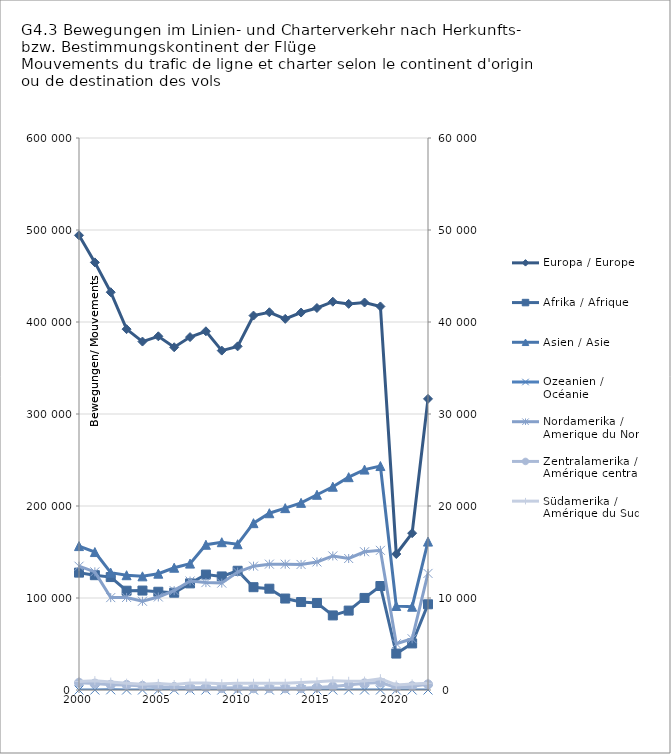
| Category | Europa / Europe |
|---|---|
| 2000.0 | 494247 |
| 2001.0 | 464792 |
| 2002.0 | 432368 |
| 2003.0 | 392219 |
| 2004.0 | 378737 |
| 2005.0 | 384453 |
| 2006.0 | 372550 |
| 2007.0 | 383593 |
| 2008.0 | 389901 |
| 2009.0 | 368933 |
| 2010.0 | 373520 |
| 2011.0 | 406994 |
| 2012.0 | 410573 |
| 2013.0 | 403430 |
| 2014.0 | 410285 |
| 2015.0 | 415226 |
| 2016.0 | 422070 |
| 2017.0 | 419704 |
| 2018.0 | 421183 |
| 2019.0 | 416907 |
| 2020.0 | 147804 |
| 2021.0 | 170462 |
| 2022.0 | 316452 |